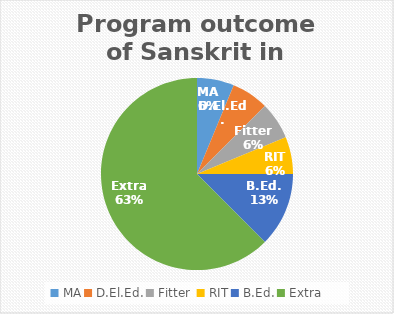
| Category | Series 0 |
|---|---|
| MA | 1 |
| D.El.Ed. | 1 |
| Fitter  | 1 |
| RIT | 1 |
| B.Ed. | 2 |
| Extra | 10 |